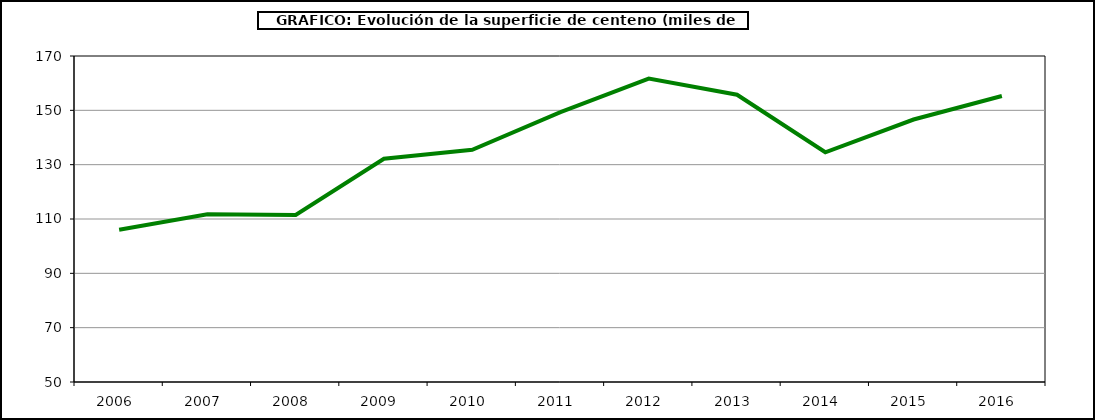
| Category | Superficie |
|---|---|
| 2006.0 | 106.073 |
| 2007.0 | 111.744 |
| 2008.0 | 111.513 |
| 2009.0 | 132.161 |
| 2010.0 | 135.488 |
| 2011.0 | 149.321 |
| 2012.0 | 161.702 |
| 2013.0 | 155.734 |
| 2014.0 | 134.563 |
| 2015.0 | 146.625 |
| 2016.0 | 155.256 |